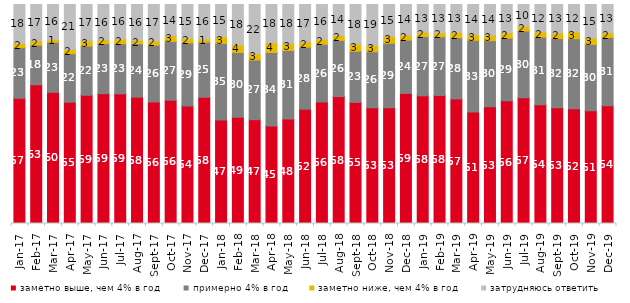
| Category | заметно выше, чем 4% в год | примерно 4% в год | заметно ниже, чем 4% в год | затрудняюсь ответить |
|---|---|---|---|---|
| 2017-01-01 | 57.15 | 23.15 | 2 | 17.7 |
| 2017-02-01 | 63.35 | 18.1 | 1.9 | 16.65 |
| 2017-03-01 | 59.9 | 22.9 | 1.25 | 15.95 |
| 2017-04-01 | 55.35 | 22.15 | 1.95 | 20.5 |
| 2017-05-01 | 58.55 | 22.45 | 2.5 | 16.5 |
| 2017-06-01 | 59.25 | 22.85 | 1.8 | 16.05 |
| 2017-07-01 | 59.2 | 22.85 | 2.1 | 15.8 |
| 2017-08-01 | 57.7 | 24.4 | 1.55 | 16.35 |
| 2017-09-01 | 55.5 | 25.95 | 1.95 | 16.6 |
| 2017-10-01 | 56.3 | 26.8 | 2.65 | 14.25 |
| 2017-11-01 | 53.6 | 28.9 | 2.05 | 15.45 |
| 2017-12-01 | 57.65 | 25.15 | 1.45 | 15.75 |
| 2018-01-01 | 47.25 | 35 | 3 | 14.75 |
| 2018-02-01 | 48.5 | 29.6 | 3.5 | 18.4 |
| 2018-03-01 | 47.4 | 27.25 | 2.9 | 22.45 |
| 2018-04-01 | 44.55 | 33.55 | 4.3 | 17.6 |
| 2018-05-01 | 47.7 | 31.3 | 3.25 | 17.75 |
| 2018-06-01 | 52.2 | 28.3 | 2.4 | 17.1 |
| 2018-07-01 | 55.5 | 26.35 | 2.25 | 15.9 |
| 2018-08-01 | 57.95 | 25.65 | 2.3 | 14.1 |
| 2018-09-01 | 55.3 | 23.35 | 3.25 | 18.1 |
| 2018-10-01 | 52.85 | 25.55 | 2.95 | 18.65 |
| 2018-11-01 | 52.844 | 29.491 | 3.144 | 14.521 |
| 2018-12-01 | 59.4 | 24.35 | 2.35 | 13.9 |
| 2019-01-01 | 58.3 | 27.05 | 2 | 12.65 |
| 2019-02-01 | 58.45 | 26.8 | 1.85 | 12.9 |
| 2019-03-01 | 56.887 | 27.946 | 2.387 | 12.78 |
| 2019-04-01 | 50.891 | 32.772 | 2.574 | 13.762 |
| 2019-05-01 | 53.343 | 30.163 | 2.526 | 13.967 |
| 2019-06-01 | 56.06 | 28.579 | 2.444 | 12.918 |
| 2019-07-01 | 57.475 | 30.396 | 2.228 | 9.901 |
| 2019-08-01 | 54.246 | 30.869 | 2.398 | 12.488 |
| 2019-09-01 | 52.822 | 31.634 | 2.475 | 13.069 |
| 2019-10-01 | 52.426 | 31.98 | 3.119 | 12.475 |
| 2019-11-01 | 51.485 | 30.297 | 2.921 | 15.297 |
| 2019-12-01 | 53.713 | 31.238 | 2.079 | 12.97 |